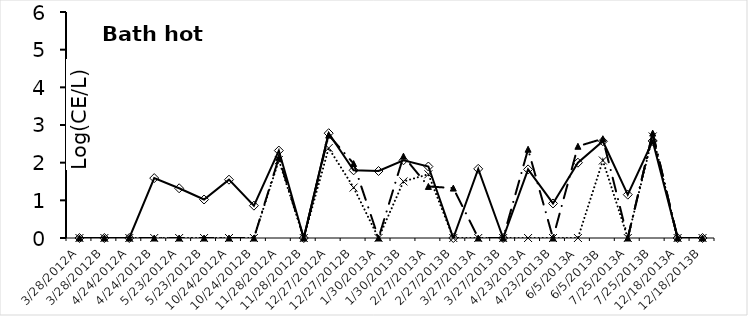
| Category | Legionella 
Log(CE/L) | rtxA  | P65/66  |
|---|---|---|---|
| 3/28/2012A | 0 | 0 | 0 |
| 3/28/2012B | 0 | 0 | 0 |
| 4/24/2012A | 0 | 0 | 0 |
| 4/24/2012B | 1.59 | 0 | 0 |
| 5/23/2012A | 1.32 | 0 | 0 |
| 5/23/2012B | 1.022 | 0 | 0 |
| 10/24/2012A | 1.549 | 0 | 0 |
| 10/24/2012B | 0.859 | 0 | 0 |
| 11/28/2012A | 2.321 | 2.129 | 2.068 |
| 11/28/2012B | 0 | 0 | 0 |
| 12/27/2012A | 2.782 | 2.732 | 2.388 |
| 12/27/2012B | 1.797 | 1.975 | 1.339 |
| 1/30/2013A | 1.779 | 0 | 0 |
| 1/30/2013B | 2.063 | 2.172 | 1.502 |
| 2/27/2013A | 1.897 | 1.369 | 1.692 |
| 2/27/2013B | 0 | 1.325 | 0 |
| 3/27/2013A | 1.836 | 0 | 0 |
| 3/27/2013B | 0 | 0 | 0 |
| 4/23/2013A | 1.821 | 2.357 | 0 |
| 4/23/2013B | 0.917 | 0 | 0 |
| 6/5/2013A | 1.999 | 2.435 | 0 |
| 6/5/2013B | 2.569 | 2.635 | 2.057 |
| 7/25/2013A | 1.151 | 0 | 0 |
| 7/25/2013B | 2.576 | 2.785 | 2.696 |
| 12/18/2013A | 0 | 0 | 0 |
| 12/18/2013B | 0 | 0 | 0 |